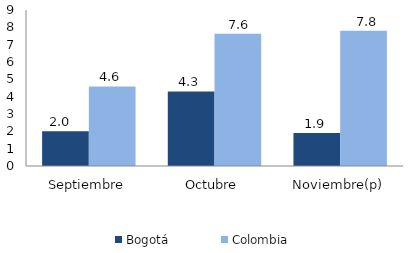
| Category | Bogotá | Colombia |
|---|---|---|
| Septiembre | 2 | 4.594 |
| Octubre | 4.299 | 7.631 |
| Noviembre(p) | 1.901 | 7.798 |